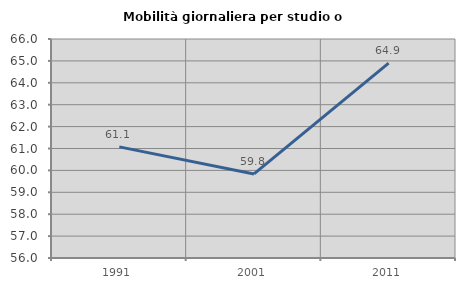
| Category | Mobilità giornaliera per studio o lavoro |
|---|---|
| 1991.0 | 61.075 |
| 2001.0 | 59.838 |
| 2011.0 | 64.898 |